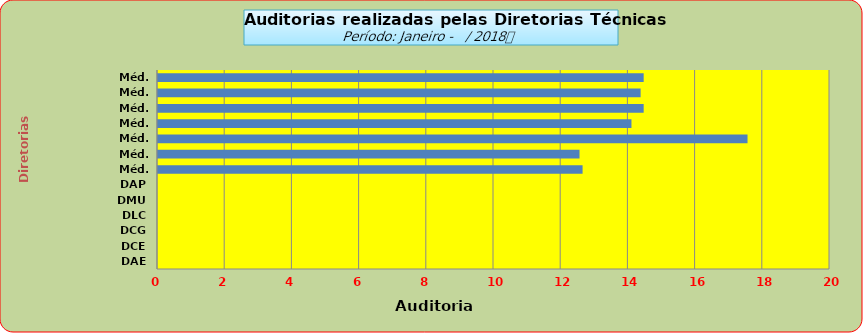
| Category | Series 0 |
|---|---|
| DAE | 0 |
| DCE | 0 |
| DCG | 0 |
| DLC | 0 |
| DMU | 0 |
| DAP | 0 |
| Méd. 2011 | 12.636 |
| Méd. 2012 | 12.545 |
| Méd. 2013 | 17.545 |
| Méd. 2014 | 14.091 |
| Méd. 2015 | 14.455 |
| Méd. 2016 | 14.364 |
| Méd. 2017 | 14.455 |